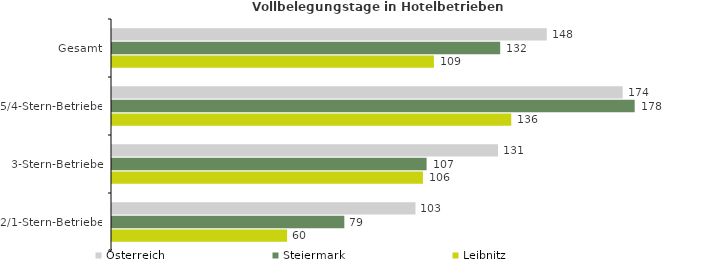
| Category | Österreich | Steiermark | Leibnitz |
|---|---|---|---|
| Gesamt | 147.876 | 132.038 | 109.493 |
| 5/4-Stern-Betriebe | 173.697 | 177.779 | 135.804 |
| 3-Stern-Betriebe | 131.294 | 107.011 | 105.754 |
| 2/1-Stern-Betriebe | 103.222 | 79.024 | 59.558 |